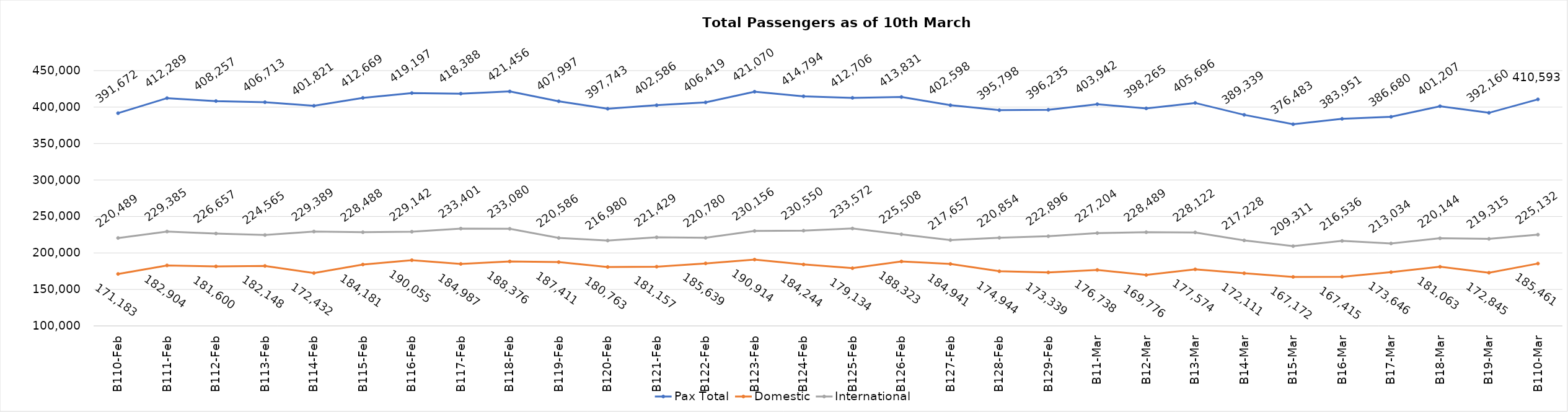
| Category | Pax Total | Domestic | International |
|---|---|---|---|
| 2024-02-10 | 391672 | 171183 | 220489 |
| 2024-02-11 | 412289 | 182904 | 229385 |
| 2024-02-12 | 408257 | 181600 | 226657 |
| 2024-02-13 | 406713 | 182148 | 224565 |
| 2024-02-14 | 401821 | 172432 | 229389 |
| 2024-02-15 | 412669 | 184181 | 228488 |
| 2024-02-16 | 419197 | 190055 | 229142 |
| 2024-02-17 | 418388 | 184987 | 233401 |
| 2024-02-18 | 421456 | 188376 | 233080 |
| 2024-02-19 | 407997 | 187411 | 220586 |
| 2024-02-20 | 397743 | 180763 | 216980 |
| 2024-02-21 | 402586 | 181157 | 221429 |
| 2024-02-22 | 406419 | 185639 | 220780 |
| 2024-02-23 | 421070 | 190914 | 230156 |
| 2024-02-24 | 414794 | 184244 | 230550 |
| 2024-02-25 | 412706 | 179134 | 233572 |
| 2024-02-26 | 413831 | 188323 | 225508 |
| 2024-02-27 | 402598 | 184941 | 217657 |
| 2024-02-28 | 395798 | 174944 | 220854 |
| 2024-02-29 | 396235 | 173339 | 222896 |
| 2024-03-01 | 403942 | 176738 | 227204 |
| 2024-03-02 | 398265 | 169776 | 228489 |
| 2024-03-03 | 405696 | 177574 | 228122 |
| 2024-03-04 | 389339 | 172111 | 217228 |
| 2024-03-05 | 376483 | 167172 | 209311 |
| 2024-03-06 | 383951 | 167415 | 216536 |
| 2024-03-07 | 386680 | 173646 | 213034 |
| 2024-03-08 | 401207 | 181063 | 220144 |
| 2024-03-09 | 392160 | 172845 | 219315 |
| 2024-03-10 | 410593 | 185461 | 225132 |